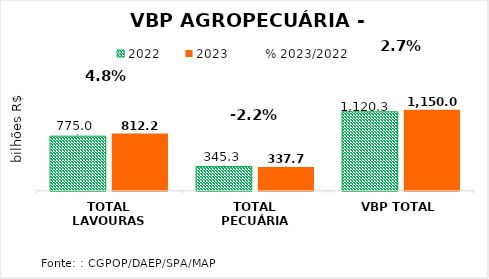
| Category | 2022 | 2023 |
|---|---|---|
| TOTAL LAVOURAS | 775 | 812.254 |
| TOTAL PECUÁRIA | 345.298 | 337.753 |
| VBP TOTAL | 1120.298 | 1150.007 |